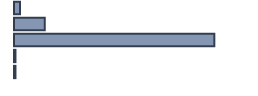
| Category | Percentatge |
|---|---|
| 0 | 2.449 |
| 1 | 12.857 |
| 2 | 83.469 |
| 3 | 0.612 |
| 4 | 0.612 |